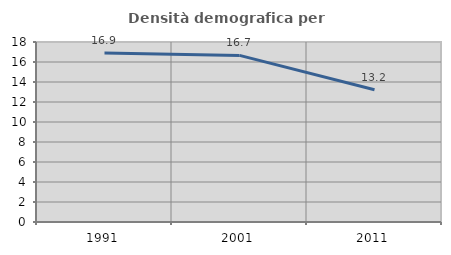
| Category | Densità demografica |
|---|---|
| 1991.0 | 16.888 |
| 2001.0 | 16.659 |
| 2011.0 | 13.222 |